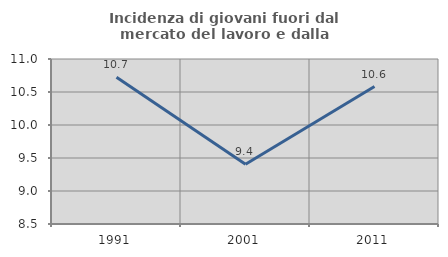
| Category | Incidenza di giovani fuori dal mercato del lavoro e dalla formazione  |
|---|---|
| 1991.0 | 10.725 |
| 2001.0 | 9.406 |
| 2011.0 | 10.583 |